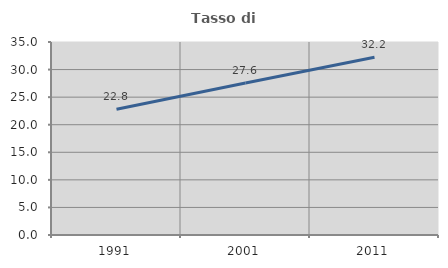
| Category | Tasso di occupazione   |
|---|---|
| 1991.0 | 22.804 |
| 2001.0 | 27.58 |
| 2011.0 | 32.238 |